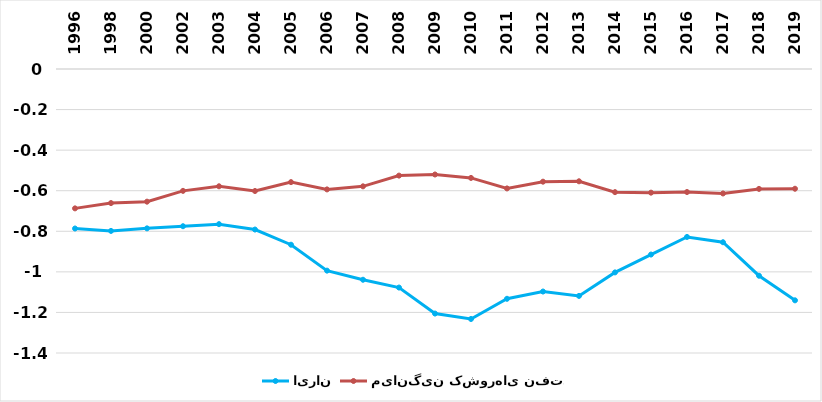
| Category | ایران | میانگین کشورهای نفتی |
|---|---|---|
| 1996.0 | -0.786 | -0.687 |
| 1998.0 | -0.798 | -0.661 |
| 2000.0 | -0.786 | -0.654 |
| 2002.0 | -0.775 | -0.601 |
| 2003.0 | -0.765 | -0.578 |
| 2004.0 | -0.791 | -0.601 |
| 2005.0 | -0.866 | -0.558 |
| 2006.0 | -0.994 | -0.594 |
| 2007.0 | -1.039 | -0.578 |
| 2008.0 | -1.077 | -0.526 |
| 2009.0 | -1.206 | -0.52 |
| 2010.0 | -1.232 | -0.537 |
| 2011.0 | -1.133 | -0.589 |
| 2012.0 | -1.097 | -0.555 |
| 2013.0 | -1.119 | -0.554 |
| 2014.0 | -1.003 | -0.607 |
| 2015.0 | -0.915 | -0.61 |
| 2016.0 | -0.828 | -0.606 |
| 2017.0 | -0.854 | -0.614 |
| 2018.0 | -1.019 | -0.591 |
| 2019.0 | -1.14 | -0.59 |